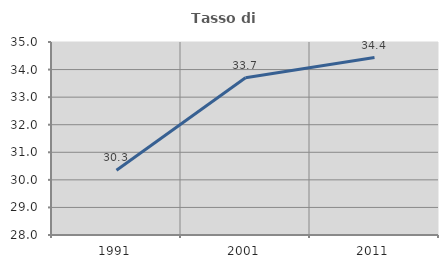
| Category | Tasso di occupazione   |
|---|---|
| 1991.0 | 30.349 |
| 2001.0 | 33.705 |
| 2011.0 | 34.436 |